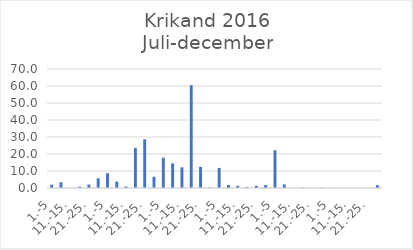
| Category | Series 0 |
|---|---|
| 1.-5 | 1.92 |
| 6.-10. | 3.411 |
| 11.-15. | 0 |
| 16.-20. | 0.766 |
| 21.-25. | 2.011 |
| 26.-31. | 5.717 |
| 1.-5 | 8.726 |
| 6.-10. | 3.787 |
| 11.-15. | 0.911 |
| 16.-20. | 23.473 |
| 21.-25. | 28.65 |
| 26.-31. | 6.625 |
| 1.-5 | 17.854 |
| 6.-10. | 14.495 |
| 11.-15. | 12.173 |
| 16.-20. | 60.504 |
| 21.-25. | 12.41 |
| 26.-30. | 0.387 |
| 1.-5 | 11.825 |
| 6.-10. | 1.783 |
| 11.-15. | 1.271 |
| 16.-20. | 0.503 |
| 21.-25. | 1.299 |
| 26.-31. | 1.691 |
| 1.-5 | 22.194 |
| 6.-10. | 2.105 |
| 11.-15. | 0 |
| 16.-20. | 0.264 |
| 21.-25. | 0 |
| 26.-30. | 0.133 |
| 1.-5 | 0.08 |
| 6.-10. | 0 |
| 11.-15. | 0 |
| 16.-20. | 0 |
| 21.-25. | 0 |
| 26.-31. | 1.652 |